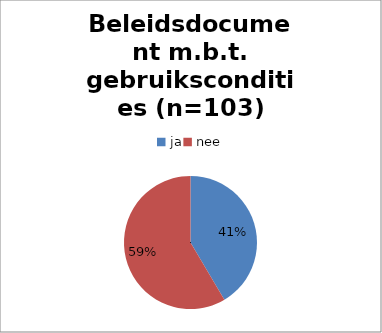
| Category | Series 0 |
|---|---|
| ja | 39 |
| nee | 55 |